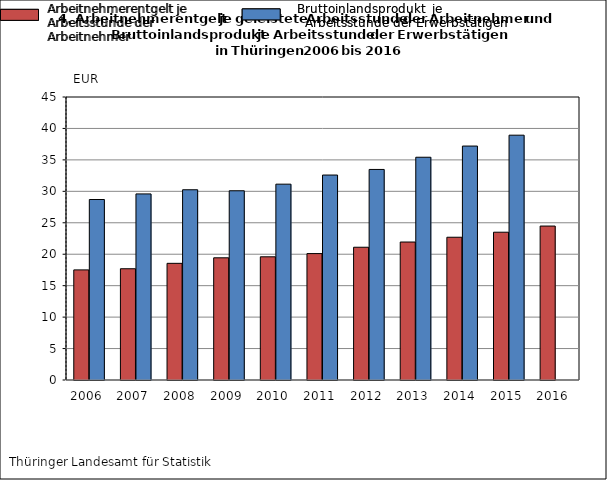
| Category | Arbeitnehmer-
entgelt je Arbeitsstunde der Arbeitnehmer | Bruttoinlands-
produkt je Arbeitsstunde der Erwerbstätigen |
|---|---|---|
| 2006.0 | 17.51 | 28.7 |
| 2007.0 | 17.69 | 29.59 |
| 2008.0 | 18.55 | 30.25 |
| 2009.0 | 19.43 | 30.09 |
| 2010.0 | 19.59 | 31.14 |
| 2011.0 | 20.1 | 32.59 |
| 2012.0 | 21.11 | 33.48 |
| 2013.0 | 21.94 | 35.42 |
| 2014.0 | 22.7 | 37.2 |
| 2015.0 | 23.5 | 38.93 |
| 2016.0 | 24.48 | 0 |